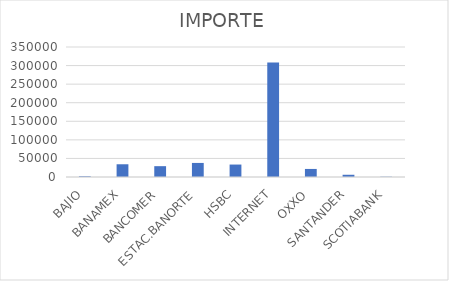
| Category | IMPORTE |
|---|---|
| BAJIO | 1945.38 |
| BANAMEX | 34291.2 |
| BANCOMER | 29154.25 |
| ESTAC.BANORTE | 37866 |
| HSBC | 33515.2 |
| INTERNET | 308430.26 |
| OXXO | 21686.47 |
| SANTANDER | 6016.5 |
| SCOTIABANK | 738.78 |